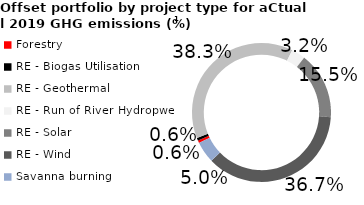
| Category | Series 0 |
|---|---|
| Forestry | 0.006 |
| RE - Biogas Utilisation | 0.006 |
| RE - Geothermal | 0.383 |
| RE - Run of River Hydropwer | 0.032 |
| RE - Solar | 0.155 |
| RE - Wind | 0.367 |
| Savanna burning | 0.05 |